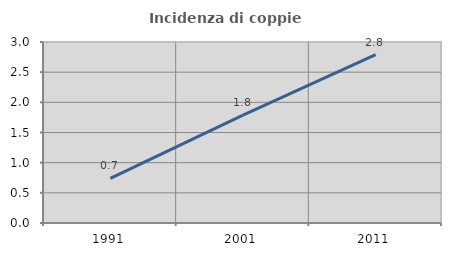
| Category | Incidenza di coppie miste |
|---|---|
| 1991.0 | 0.741 |
| 2001.0 | 1.788 |
| 2011.0 | 2.789 |